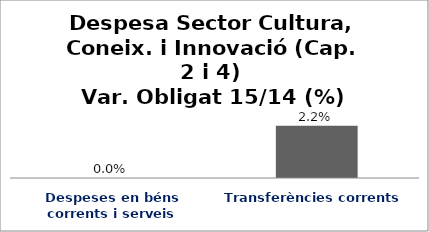
| Category | Series 0 |
|---|---|
| Despeses en béns corrents i serveis | 0 |
| Transferències corrents | 0.022 |